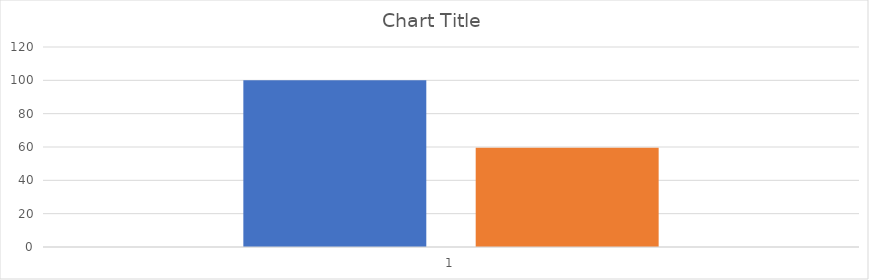
| Category | OR | C179GAL4>2xCNBPi |
|---|---|---|
| 0 | 100 | 59.521 |